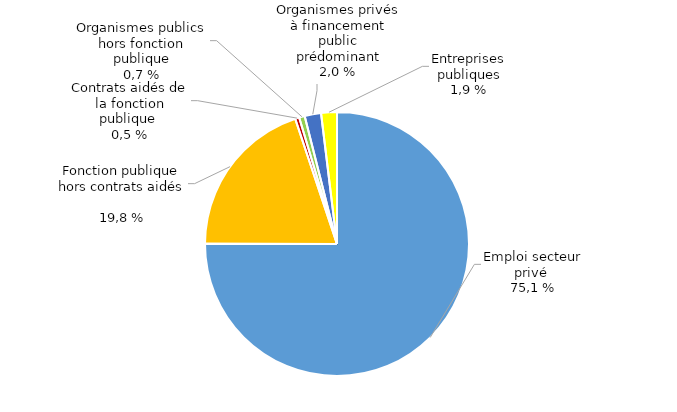
| Category | Series 1 |
|---|---|
| Emploi secteur privé | 75.06 |
| Fonction publique hors contrats aidés  | 19.813 |
| Contrats aidés de la fonction publique  | 0.498 |
| Organismes publics hors fonction publique | 0.687 |
| Organismes privés à financement public prédominant | 2.007 |
| Entreprises publiques | 1.935 |